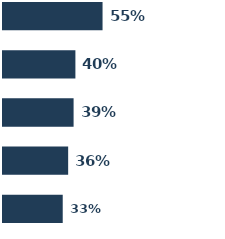
| Category | Series 0 | Series 1 | Series 2 | Series 3 | Series 4 |
|---|---|---|---|---|---|
| 0 | 0.55 | 0.4 | 0.39 | 0.36 | 0.33 |